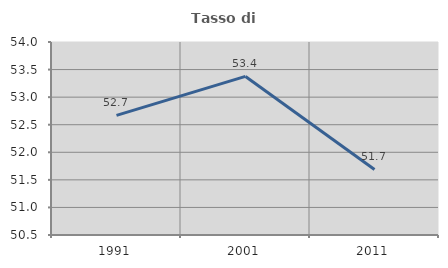
| Category | Tasso di occupazione   |
|---|---|
| 1991.0 | 52.669 |
| 2001.0 | 53.376 |
| 2011.0 | 51.689 |